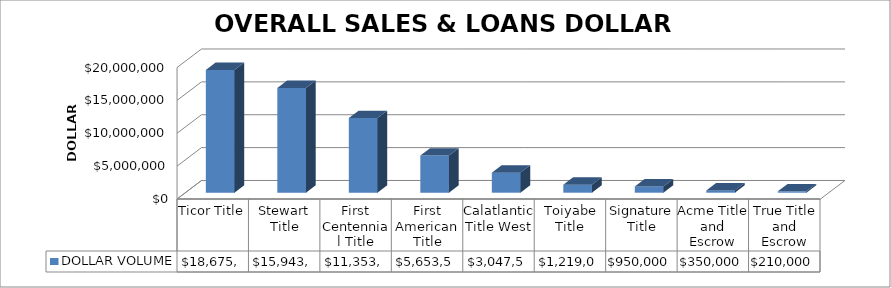
| Category | DOLLAR VOLUME |
|---|---|
| Ticor Title | 18675903 |
| Stewart Title | 15943064.08 |
| First Centennial Title | 11353252 |
| First American Title | 5653597 |
| Calatlantic Title West | 3047559 |
| Toiyabe Title | 1219000 |
| Signature Title | 950000 |
| Acme Title and Escrow | 350000 |
| True Title and Escrow | 210000 |